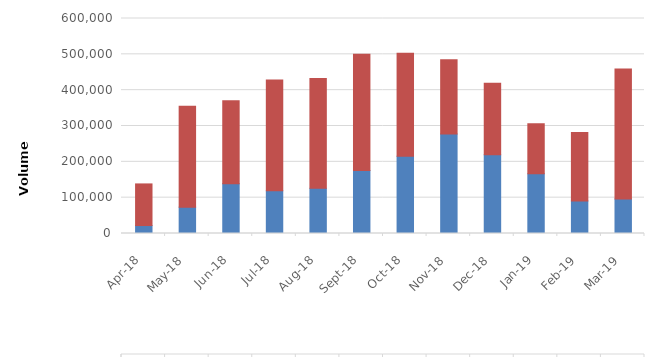
| Category | Buy Volume | Sell Volume |
|---|---|---|
| 2018-04-01 | 22190 | 116182 |
| 2018-05-01 | 73582.5 | 281479.5 |
| 2018-06-01 | 139079.5 | 231333.4 |
| 2018-07-01 | 119046.5 | 309497 |
| 2018-08-01 | 126069 | 306662.2 |
| 2018-09-01 | 176040.5 | 324343.6 |
| 2018-10-01 | 215568 | 287177 |
| 2018-11-01 | 277397 | 207470.26 |
| 2018-12-01 | 219661 | 199822.9 |
| 2019-01-01 | 166624.5 | 139914.2 |
| 2019-02-01 | 90986.8 | 190646.9 |
| 2019-03-01 | 96430.5 | 362677.2 |